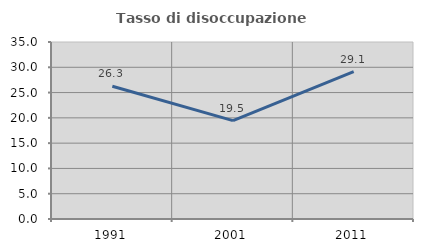
| Category | Tasso di disoccupazione giovanile  |
|---|---|
| 1991.0 | 26.26 |
| 2001.0 | 19.463 |
| 2011.0 | 29.134 |